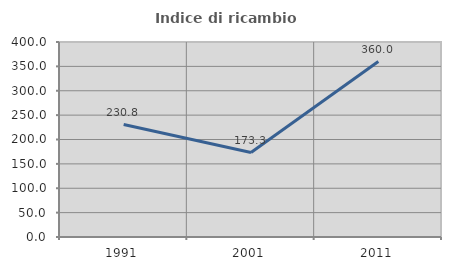
| Category | Indice di ricambio occupazionale  |
|---|---|
| 1991.0 | 230.769 |
| 2001.0 | 173.333 |
| 2011.0 | 360 |